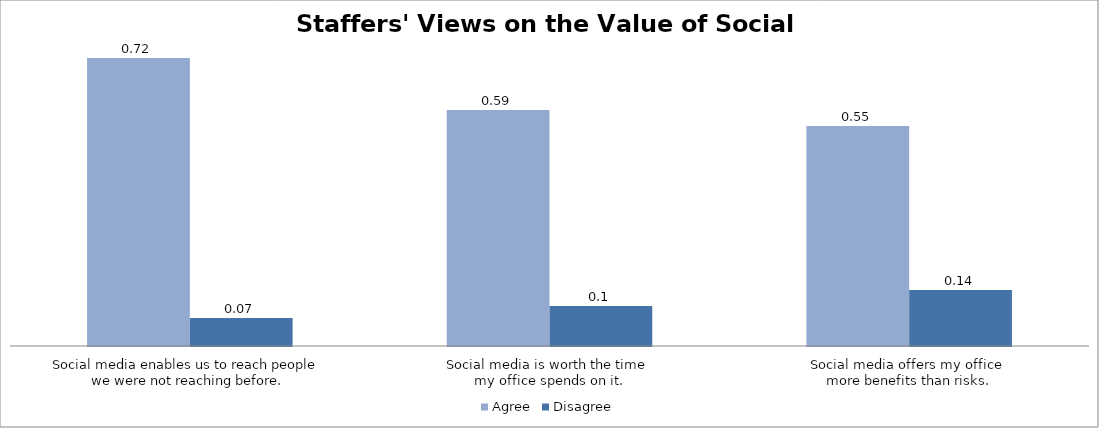
| Category | Agree | Disagree |
|---|---|---|
| Social media enables us to reach people 
we were not reaching before. | 0.72 | 0.07 |
| Social media is worth the time 
my office spends on it. | 0.59 | 0.1 |
| Social media offers my office 
more benefits than risks. | 0.55 | 0.14 |